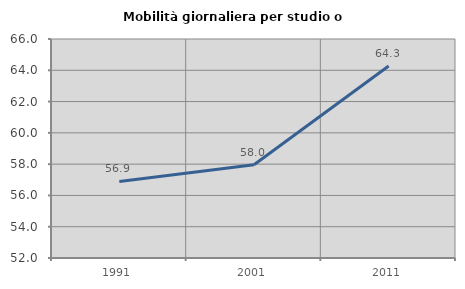
| Category | Mobilità giornaliera per studio o lavoro |
|---|---|
| 1991.0 | 56.891 |
| 2001.0 | 57.957 |
| 2011.0 | 64.27 |